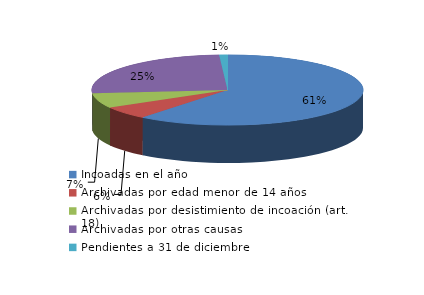
| Category | Series 0 |
|---|---|
| Incoadas en el año | 246 |
| Archivadas por edad menor de 14 años | 24 |
| Archivadas por desistimiento de incoación (art. 18) | 28 |
| Archivadas por otras causas | 103 |
| Pendientes a 31 de diciembre | 4 |